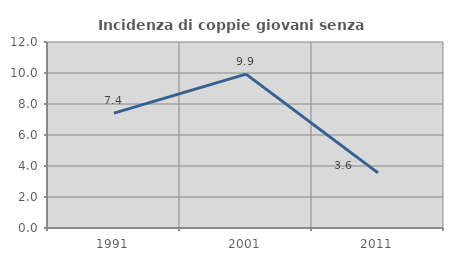
| Category | Incidenza di coppie giovani senza figli |
|---|---|
| 1991.0 | 7.407 |
| 2001.0 | 9.926 |
| 2011.0 | 3.554 |